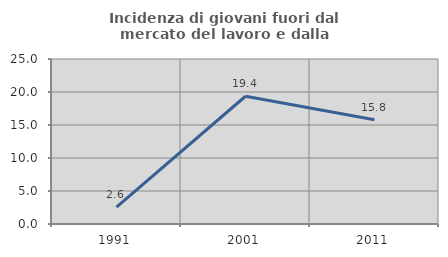
| Category | Incidenza di giovani fuori dal mercato del lavoro e dalla formazione  |
|---|---|
| 1991.0 | 2.564 |
| 2001.0 | 19.355 |
| 2011.0 | 15.789 |